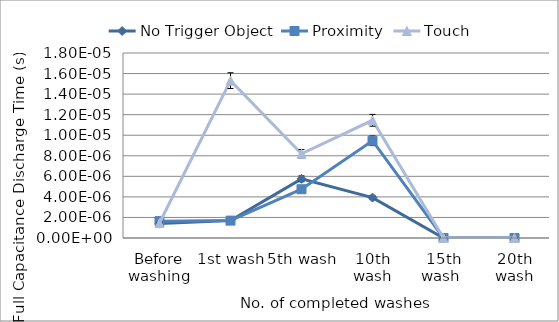
| Category | No Trigger Object | Proximity | Touch |
|---|---|---|---|
| Before washing | 0 | 0 | 0 |
| 1st wash | 0 | 0 | 0 |
| 5th wash | 0 | 0 | 0 |
| 10th wash | 0 | 0 | 0 |
| 15th wash  | 0 | 0 | 0 |
| 20th wash | 0 | 0 | 0 |